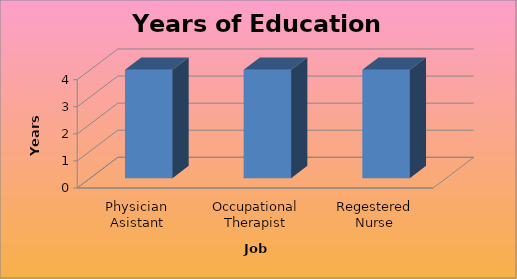
| Category | Series 0 |
|---|---|
| Physician Asistant | 4 |
| Occupational Therapist | 4 |
| Regestered Nurse | 4 |